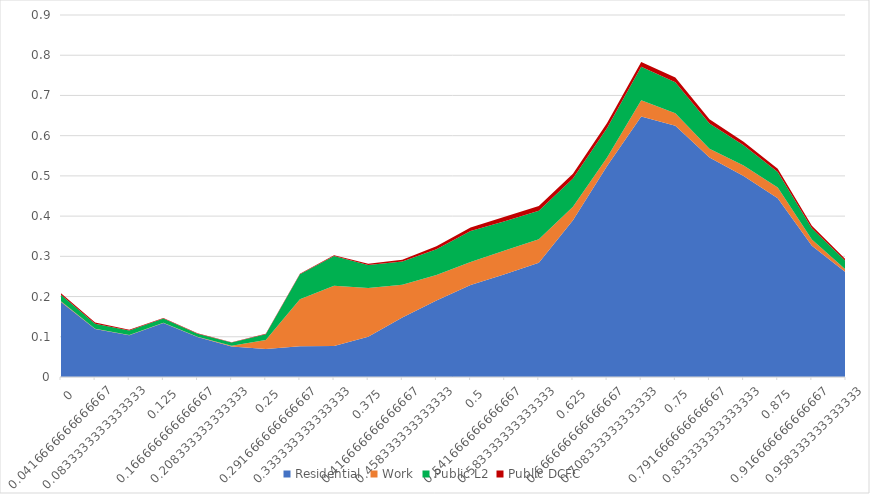
| Category | Residential | Work | Public L2 | Public DCFC |
|---|---|---|---|---|
| 0.0 | 0.186 | 0.002 | 0.016 | 0.004 |
| 0.0416666666666667 | 0.119 | 0.001 | 0.013 | 0.003 |
| 0.0833333333333333 | 0.104 | 0.001 | 0.011 | 0.002 |
| 0.125 | 0.134 | 0.001 | 0.011 | 0.002 |
| 0.166666666666667 | 0.1 | 0.001 | 0.008 | 0.001 |
| 0.208333333333333 | 0.076 | 0.002 | 0.008 | 0.001 |
| 0.25 | 0.069 | 0.023 | 0.015 | 0.001 |
| 0.291666666666667 | 0.077 | 0.116 | 0.062 | 0.002 |
| 0.333333333333333 | 0.077 | 0.15 | 0.074 | 0.002 |
| 0.375 | 0.1 | 0.121 | 0.057 | 0.003 |
| 0.416666666666667 | 0.148 | 0.081 | 0.058 | 0.005 |
| 0.458333333333333 | 0.19 | 0.063 | 0.065 | 0.007 |
| 0.5 | 0.229 | 0.057 | 0.077 | 0.009 |
| 0.541666666666667 | 0.256 | 0.059 | 0.072 | 0.011 |
| 0.583333333333333 | 0.284 | 0.059 | 0.071 | 0.012 |
| 0.625 | 0.39 | 0.033 | 0.071 | 0.012 |
| 0.666666666666667 | 0.524 | 0.021 | 0.074 | 0.012 |
| 0.708333333333333 | 0.648 | 0.041 | 0.083 | 0.012 |
| 0.75 | 0.625 | 0.031 | 0.077 | 0.012 |
| 0.791666666666667 | 0.546 | 0.021 | 0.063 | 0.01 |
| 0.833333333333333 | 0.5 | 0.026 | 0.05 | 0.009 |
| 0.875 | 0.444 | 0.027 | 0.039 | 0.008 |
| 0.916666666666667 | 0.326 | 0.016 | 0.028 | 0.006 |
| 0.958333333333333 | 0.26 | 0.006 | 0.021 | 0.004 |